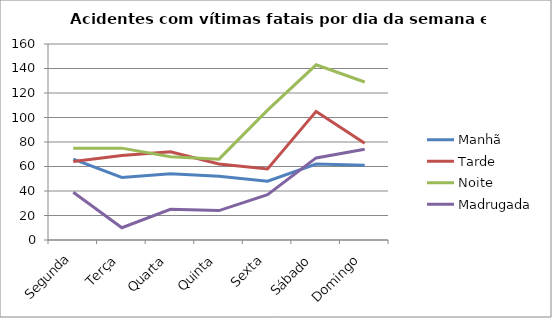
| Category | Manhã | Tarde | Noite | Madrugada |
|---|---|---|---|---|
| Segunda | 66 | 64 | 75 | 39 |
| Terça | 51 | 69 | 75 | 10 |
| Quarta | 54 | 72 | 68 | 25 |
| Quinta | 52 | 62 | 66 | 24 |
| Sexta | 48 | 58 | 106 | 37 |
| Sábado | 62 | 105 | 143 | 67 |
| Domingo | 61 | 79 | 129 | 74 |